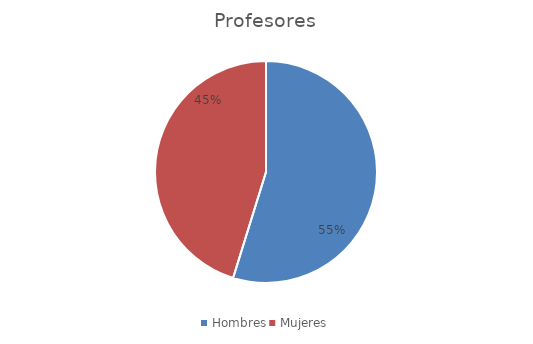
| Category | Profesores |
|---|---|
| Hombres | 40 |
| Mujeres | 33 |